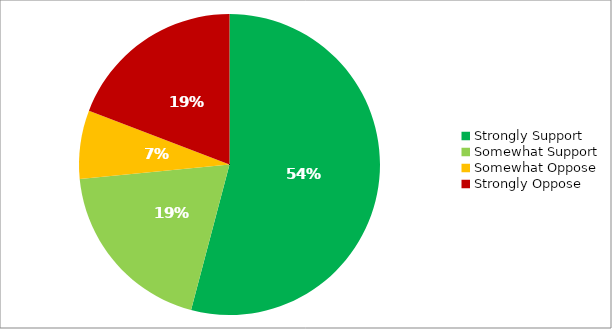
| Category | Responses |
|---|---|
| Strongly Support | 0.541 |
| Somewhat Support | 0.193 |
| Somewhat Oppose | 0.074 |
| Strongly Oppose | 0.192 |